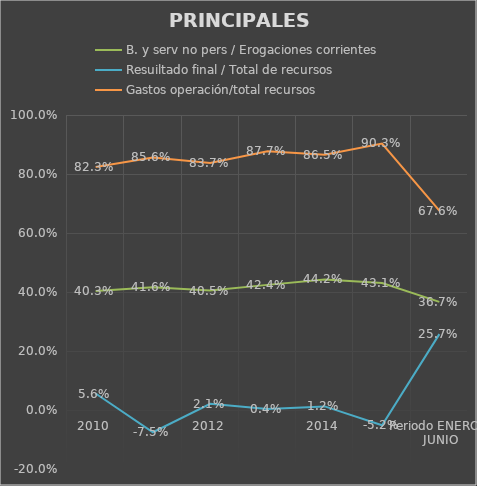
| Category | B. y serv no pers / Erogaciones corrientes | Resuiltado final / Total de recursos | Gastos operación/total recursos |
|---|---|---|---|
| 2010 | 0.403 | 0.056 | 0.823 |
| 2011 | 0.416 | -0.075 | 0.856 |
| 2012 | 0.405 | 0.021 | 0.837 |
| 2013 | 0.424 | 0.004 | 0.877 |
| 2014 | 0.442 | 0.012 | 0.865 |
| 2015 | 0.431 | -0.052 | 0.903 |
|   Periodo ENERO  /   JUNIO | 0.367 | 0.257 | 0.676 |